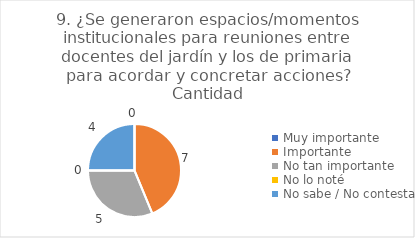
| Category | 9. ¿Se generaron espacios/momentos institucionales para reuniones entre docentes del jardín y los de primaria para acordar y concretar acciones? |
|---|---|
| Muy importante  | 0 |
| Importante  | 0.438 |
| No tan importante  | 0.312 |
| No lo noté  | 0 |
| No sabe / No contesta | 0.25 |